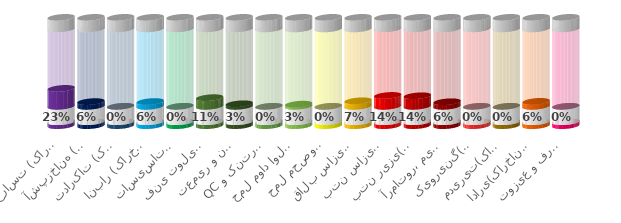
| Category | Series 0 | Series 1 | Series 2 | Series 3 | Series 4 |
|---|---|---|---|---|---|
| حراست (کارخانه) | 0.05 | 0.2 | 0.232 | 0.768 | 0.15 |
| آشپزخانه (کارخانه) | 0.05 | 0.2 | 0.061 | 0.939 | 0.15 |
| تدارکات (کارخانه) | 0.05 | 0.2 | 0 | 1 | 0.15 |
| انبار (کارخانه) | 0.05 | 0.2 | 0.062 | 0.938 | 0.15 |
| تاسیسات (کارخانه) | 0.05 | 0.2 | 0 | 1 | 0.15 |
| فنی تولید (کارخانه) | 0.05 | 0.2 | 0.112 | 0.888 | 0.15 |
| تعمیر و نگهداری(کارخانه) | 0.05 | 0.2 | 0.033 | 0.967 | 0.15 |
| QC و کنترل کیفیت(کارخانه) | 0.05 | 0.2 | 0 | 1 | 0.15 |
| حمل مواد اولیه (کارخانه) | 0.05 | 0.2 | 0.028 | 0.972 | 0.15 |
| حمل محصولات و سایر(کارخانه) | 0.05 | 0.2 | 0 | 1 | 0.15 |
| قالب سازی(کارخانه) | 0.05 | 0.2 | 0.071 | 0.929 | 0.15 |
| بتن سازی(کارخانه) | 0.05 | 0.2 | 0.141 | 0.859 | 0.15 |
| بتن ریزی(کارخانه) | 0.05 | 0.2 | 0.136 | 0.864 | 0.15 |
| آرماتور، میلگرد (کارخانه) | 0.05 | 0.2 | 0.059 | 0.941 | 0.15 |
| کیورینگ(کارخانه) | 0.05 | 0.2 | 0 | 1 | 0.15 |
| مدیریت(کارخانه) | 0.05 | 0.2 | 0 | 1 | 0.15 |
| اداری(کارخانه) | 0.05 | 0.2 | 0.064 | 0.936 | 0.15 |
| توزیع و فروش | 0.05 | 0.2 | 0 | 1 | 0.15 |